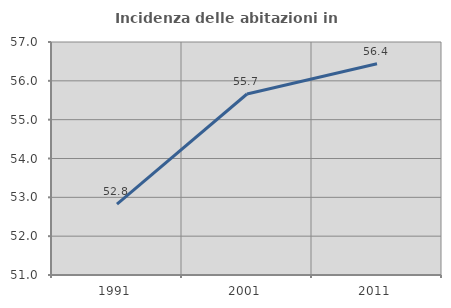
| Category | Incidenza delle abitazioni in proprietà  |
|---|---|
| 1991.0 | 52.825 |
| 2001.0 | 55.661 |
| 2011.0 | 56.439 |